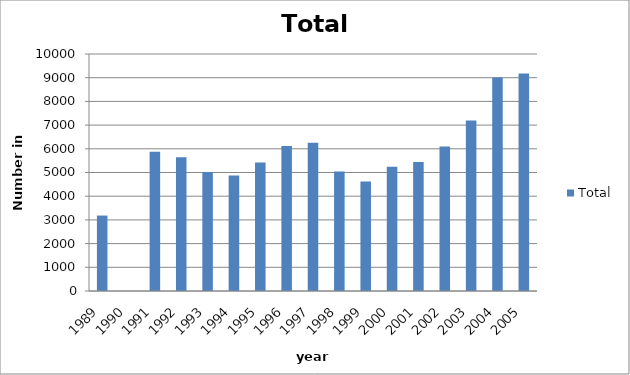
| Category | Total |
|---|---|
| 1989 | 3183 |
| 1990 | 0 |
| 1991 | 5872 |
| 1992 | 5648 |
| 1993 | 5024 |
| 1994 | 4876 |
| 1995 | 5426 |
| 1996 | 6116 |
| 1997 | 6254 |
| 1998 | 5044 |
| 1999 | 4622 |
| 2000 | 5246 |
| 2001 | 5444 |
| 2002 | 6102 |
| 2003 | 7195 |
| 2004 | 9007 |
| 2005 | 9173 |